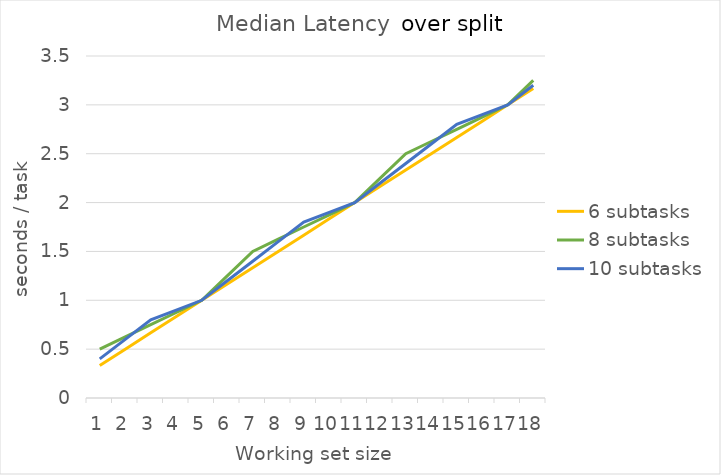
| Category | 6 subtasks | 8 subtasks | 10 subtasks |
|---|---|---|---|
| 0 | 0.333 | 0.5 | 0.4 |
| 1 | 0.5 | 0.625 | 0.6 |
| 2 | 0.667 | 0.75 | 0.8 |
| 3 | 0.833 | 0.875 | 0.9 |
| 4 | 1 | 1 | 1 |
| 5 | 1.167 | 1.25 | 1.2 |
| 6 | 1.333 | 1.5 | 1.4 |
| 7 | 1.5 | 1.625 | 1.6 |
| 8 | 1.667 | 1.75 | 1.8 |
| 9 | 1.833 | 1.875 | 1.9 |
| 10 | 2 | 2 | 2 |
| 11 | 2.167 | 2.25 | 2.2 |
| 12 | 2.333 | 2.5 | 2.4 |
| 13 | 2.5 | 2.625 | 2.6 |
| 14 | 2.667 | 2.75 | 2.8 |
| 15 | 2.833 | 2.875 | 2.9 |
| 16 | 3 | 3 | 3 |
| 17 | 3.167 | 3.25 | 3.2 |